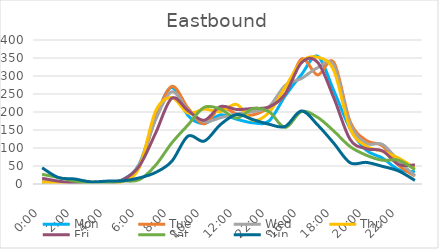
| Category | Mon | Tue | Wed | Thu | Fri | Sat | Sun |
|---|---|---|---|---|---|---|---|
| 0.0 | 5 | 6 | 8 | 6 | 16 | 27 | 45 |
| 0.041667 | 4 | 3 | 4 | 2 | 8 | 18 | 18 |
| 0.083333 | 1 | 3 | 2 | 4 | 3 | 8 | 14 |
| 0.125 | 2 | 0 | 1 | 6 | 3 | 3 | 6 |
| 0.166667 | 4 | 4 | 6 | 1 | 2 | 4 | 8 |
| 0.208333 | 13 | 9 | 11 | 8 | 12 | 8 | 9 |
| 0.25 | 56 | 51 | 55 | 46 | 50 | 12 | 17 |
| 0.291667 | 185 | 182 | 178 | 202 | 141 | 52 | 32 |
| 0.333333 | 268 | 271 | 256 | 240 | 238 | 114 | 63 |
| 0.375 | 190 | 211 | 205 | 197 | 204 | 164 | 133 |
| 0.416667 | 168 | 167 | 173 | 208 | 177 | 213 | 119 |
| 0.458333 | 192 | 212 | 184 | 201 | 215 | 208 | 165 |
| 0.5 | 180 | 195 | 195 | 221 | 207 | 183 | 193 |
| 0.541667 | 170 | 192 | 201 | 177 | 210 | 209 | 179 |
| 1900-01-02 22:00:00 | 175 | 212 | 215 | 199 | 214 | 201 | 166 |
| 0.625 | 245 | 250 | 274 | 269 | 250 | 157 | 160 |
| 0.666667 | 304 | 347 | 293 | 340 | 337 | 201 | 203 |
| 0.708333 | 355 | 303 | 323 | 352 | 338 | 185 | 164 |
| 0.75 | 259 | 338 | 330 | 315 | 239 | 147 | 113 |
| 0.791667 | 154 | 174 | 168 | 154 | 124 | 104 | 59 |
| 0.833333 | 94 | 121 | 113 | 105 | 98 | 80 | 60 |
| 0.875 | 72 | 106 | 110 | 91 | 92 | 66 | 49 |
| 0.916667 | 40 | 52 | 64 | 72 | 54 | 66 | 36 |
| 0.958333 | 34 | 22 | 23 | 44 | 53 | 40 | 10 |